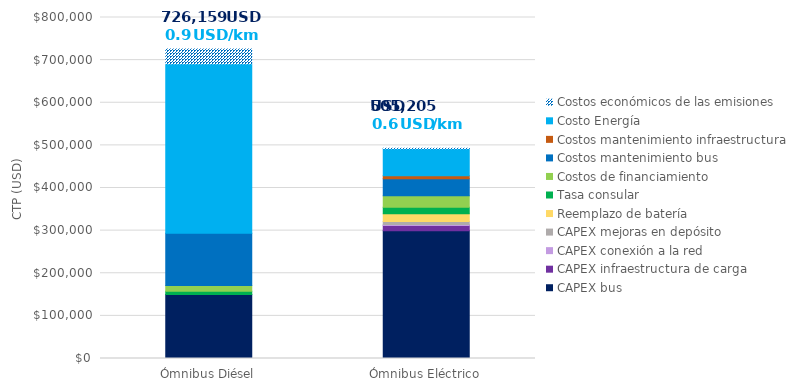
| Category | CAPEX bus | CAPEX infraestructura de carga | CAPEX conexión a la red | CAPEX mejoras en depósito | Reemplazo de batería | Tasa consular | Costos de financiamiento | Costos mantenimiento bus | Costos mantenimiento infraestructura | Costo Energía | Costos económicos de las emisiones |
|---|---|---|---|---|---|---|---|---|---|---|---|
| Ómnibus Diésel | 150000 | 0 | 0 | 0 | 0 | 7500 | 13620.779 | 122810.811 | 0 | 397366.4 | 34860.572 |
| Ómnibus Eléctrico | 300000 | 12100 | 2000 | 7500 | 18000 | 15000 | 27241.557 | 39956.757 | 6912 | 63611.155 | 883.2 |